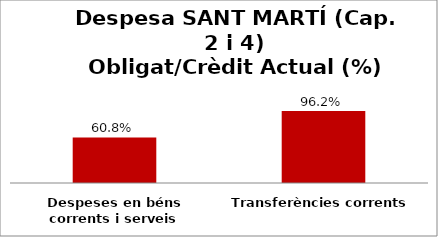
| Category | Series 0 |
|---|---|
| Despeses en béns corrents i serveis | 0.608 |
| Transferències corrents | 0.962 |